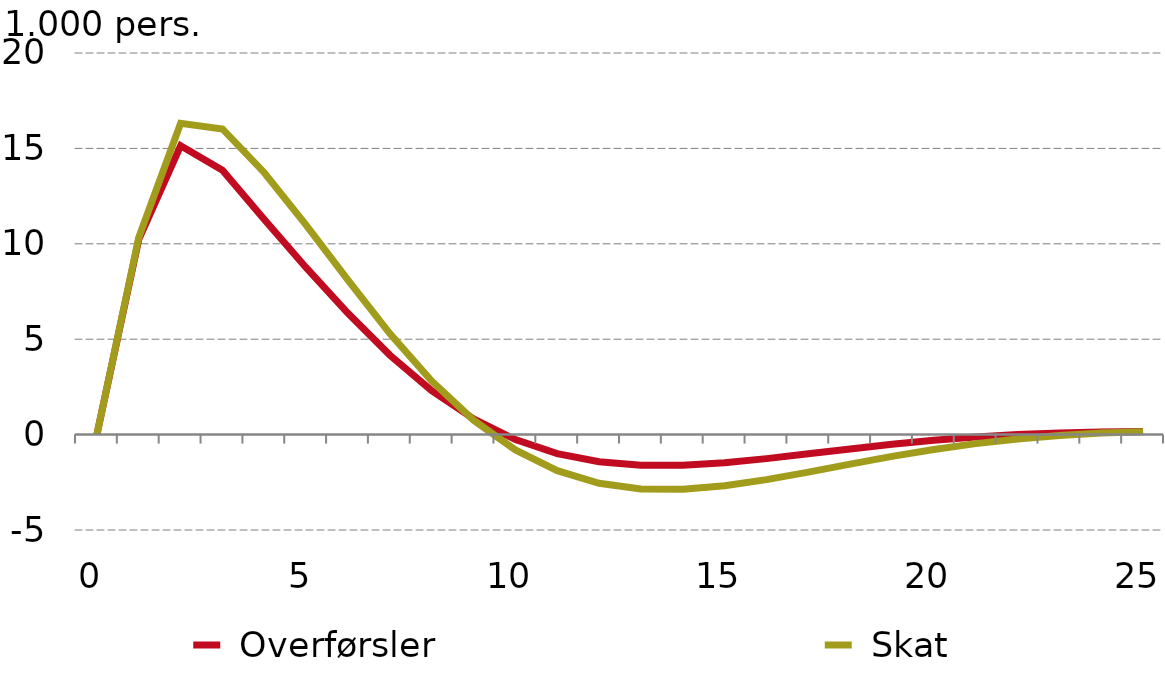
| Category |  Overførsler |  Skat |
|---|---|---|
| 0.0 | 0 | 0 |
| nan | 10.229 | 10.328 |
| nan | 15.138 | 16.312 |
| nan | 13.856 | 16.019 |
| nan | 11.268 | 13.726 |
| 5.0 | 8.747 | 10.981 |
| nan | 6.357 | 8.095 |
| nan | 4.169 | 5.297 |
| nan | 2.305 | 2.806 |
| nan | 0.827 | 0.756 |
| 10.0 | -0.262 | -0.805 |
| nan | -0.995 | -1.891 |
| nan | -1.423 | -2.55 |
| nan | -1.606 | -2.851 |
| nan | -1.603 | -2.869 |
| 15.0 | -1.47 | -2.681 |
| nan | -1.258 | -2.36 |
| nan | -1.008 | -1.965 |
| nan | -0.751 | -1.548 |
| nan | -0.51 | -1.144 |
| 20.0 | -0.301 | -0.781 |
| nan | -0.13 | -0.473 |
| nan | -0.001 | -0.228 |
| nan | 0.088 | -0.046 |
| nan | 0.141 | 0.078 |
| 25.0 | 0.165 | 0.151 |